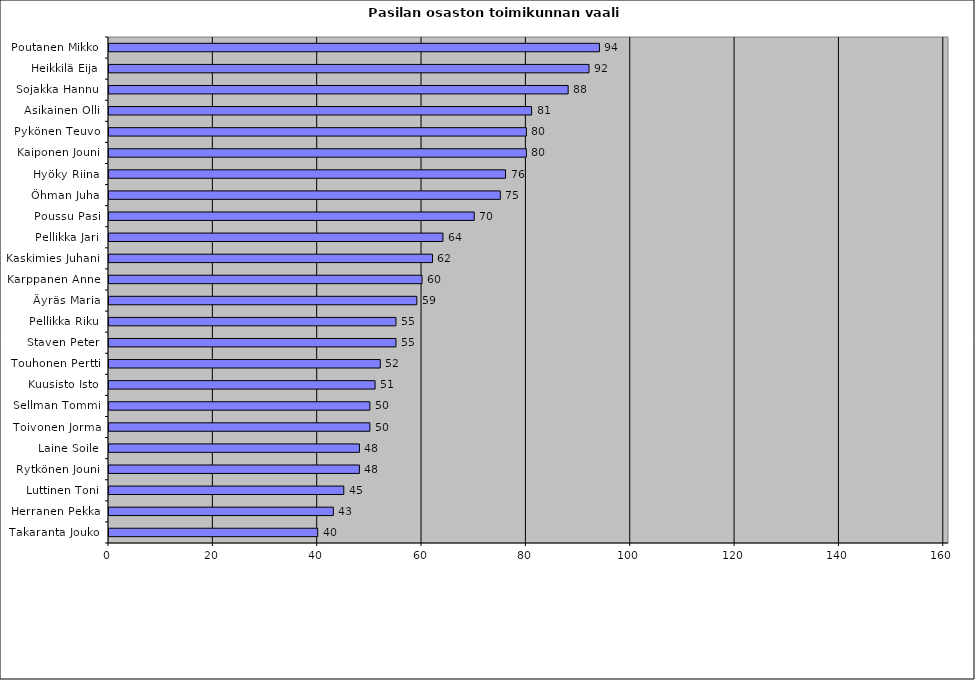
| Category | Series 0 |
|---|---|
| Poutanen Mikko | 94 |
| Heikkilä Eija | 92 |
| Sojakka Hannu | 88 |
| Asikainen Olli | 81 |
| Pykönen Teuvo | 80 |
| Kaiponen Jouni | 80 |
| Hyöky Riina | 76 |
| Öhman Juha | 75 |
| Poussu Pasi | 70 |
| Pellikka Jari | 64 |
| Kaskimies Juhani | 62 |
| Karppanen Anne | 60 |
| Äyräs Maria | 59 |
| Pellikka Riku | 55 |
| Staven Peter | 55 |
| Touhonen Pertti | 52 |
| Kuusisto Isto | 51 |
| Sellman Tommi | 50 |
| Toivonen Jorma | 50 |
| Laine Soile | 48 |
| Rytkönen Jouni | 48 |
| Luttinen Toni | 45 |
| Herranen Pekka | 43 |
| Takaranta Jouko | 40 |